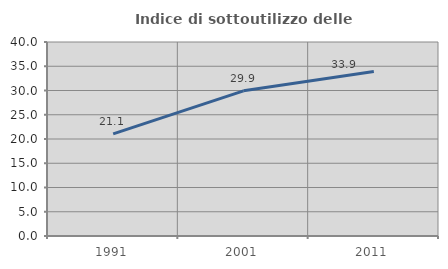
| Category | Indice di sottoutilizzo delle abitazioni  |
|---|---|
| 1991.0 | 21.064 |
| 2001.0 | 29.928 |
| 2011.0 | 33.929 |